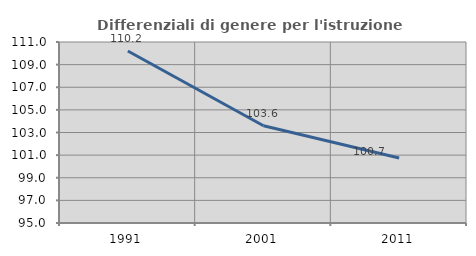
| Category | Differenziali di genere per l'istruzione superiore |
|---|---|
| 1991.0 | 110.202 |
| 2001.0 | 103.595 |
| 2011.0 | 100.744 |